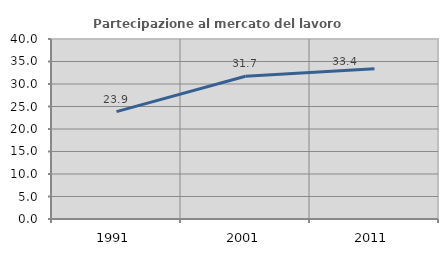
| Category | Partecipazione al mercato del lavoro  femminile |
|---|---|
| 1991.0 | 23.858 |
| 2001.0 | 31.736 |
| 2011.0 | 33.385 |